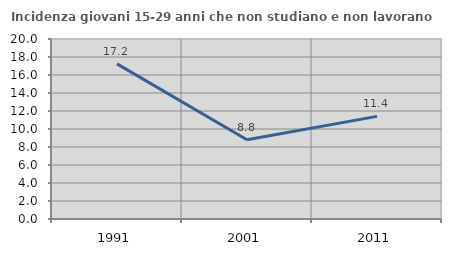
| Category | Incidenza giovani 15-29 anni che non studiano e non lavorano  |
|---|---|
| 1991.0 | 17.237 |
| 2001.0 | 8.798 |
| 2011.0 | 11.402 |